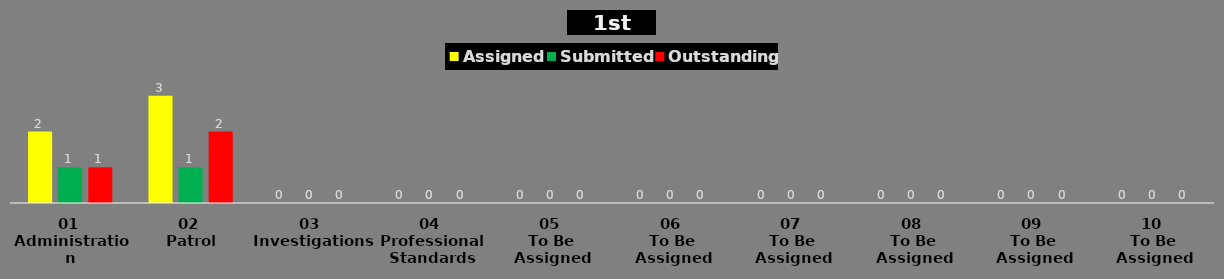
| Category | Assigned | Submitted | Outstanding |
|---|---|---|---|
| 01 
Administration | 2 | 1 | 1 |
| 02 
Patrol | 3 | 1 | 2 |
| 03 
Investigations | 0 | 0 | 0 |
| 04 
Professional Standards | 0 | 0 | 0 |
| 05 
To Be Assigned | 0 | 0 | 0 |
| 06 
To Be Assigned | 0 | 0 | 0 |
| 07 
To Be Assigned | 0 | 0 | 0 |
| 08 
To Be Assigned | 0 | 0 | 0 |
| 09 
To Be Assigned | 0 | 0 | 0 |
| 10 
To Be Assigned | 0 | 0 | 0 |